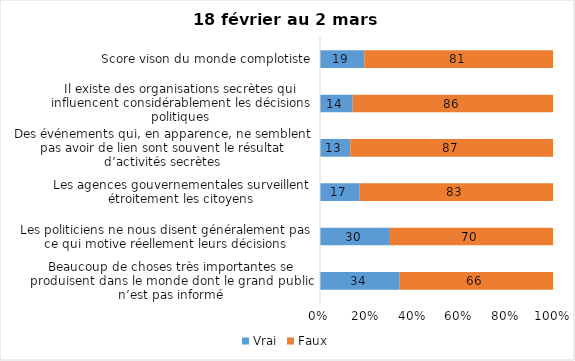
| Category | Vrai | Faux |
|---|---|---|
| Beaucoup de choses très importantes se produisent dans le monde dont le grand public n’est pas informé | 34 | 66 |
| Les politiciens ne nous disent généralement pas ce qui motive réellement leurs décisions | 30 | 70 |
| Les agences gouvernementales surveillent étroitement les citoyens | 17 | 83 |
| Des événements qui, en apparence, ne semblent pas avoir de lien sont souvent le résultat d’activités secrètes | 13 | 87 |
| Il existe des organisations secrètes qui influencent considérablement les décisions politiques | 14 | 86 |
| Score vison du monde complotiste | 19 | 81 |